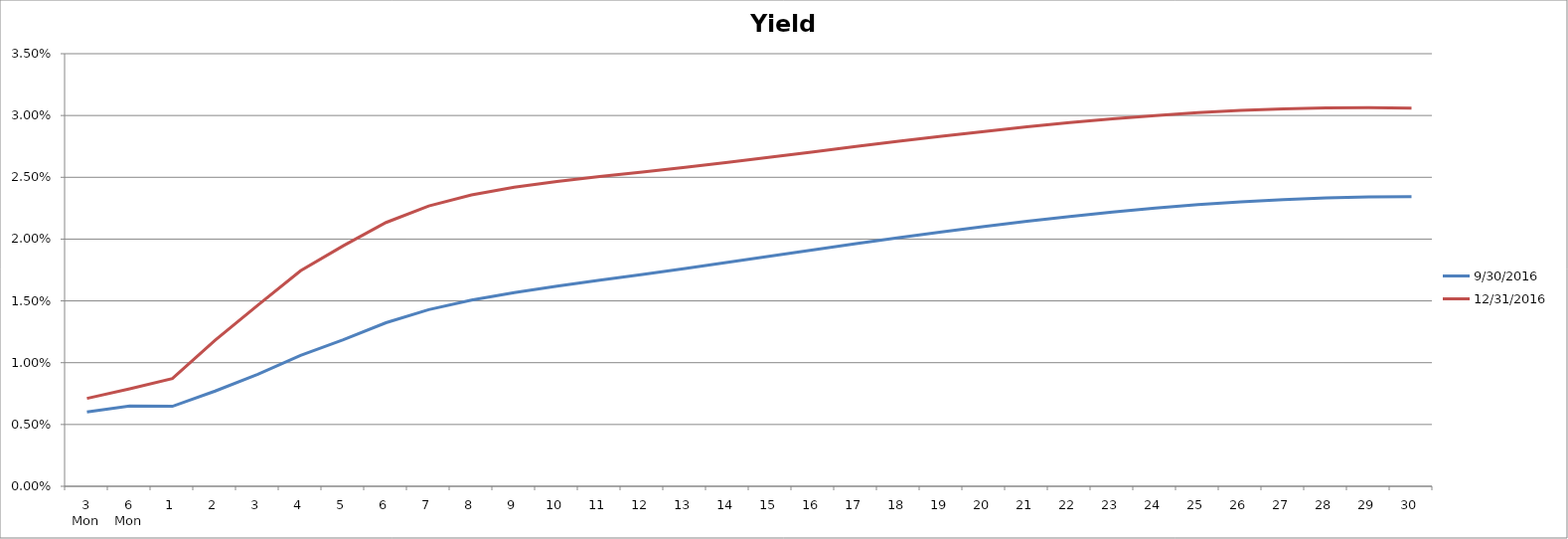
| Category | 9/30/2016 | 12/31/2016 |
|---|---|---|
| 3 Mon | 0.006 | 0.007 |
| 6 Mon | 0.007 | 0.008 |
| 1 | 0.006 | 0.009 |
| 2 | 0.008 | 0.012 |
| 3 | 0.009 | 0.015 |
| 4 | 0.011 | 0.017 |
| 5 | 0.012 | 0.019 |
| 6 | 0.013 | 0.021 |
| 7 | 0.014 | 0.023 |
| 8 | 0.015 | 0.024 |
| 9 | 0.016 | 0.024 |
| 10 | 0.016 | 0.025 |
| 11 | 0.017 | 0.025 |
| 12 | 0.017 | 0.025 |
| 13 | 0.018 | 0.026 |
| 14 | 0.018 | 0.026 |
| 15 | 0.019 | 0.027 |
| 16 | 0.019 | 0.027 |
| 17 | 0.02 | 0.027 |
| 18 | 0.02 | 0.028 |
| 19 | 0.021 | 0.028 |
| 20 | 0.021 | 0.029 |
| 21 | 0.021 | 0.029 |
| 22 | 0.022 | 0.029 |
| 23 | 0.022 | 0.03 |
| 24 | 0.023 | 0.03 |
| 25 | 0.023 | 0.03 |
| 26 | 0.023 | 0.03 |
| 27 | 0.023 | 0.031 |
| 28 | 0.023 | 0.031 |
| 29 | 0.023 | 0.031 |
| 30 | 0.023 | 0.031 |